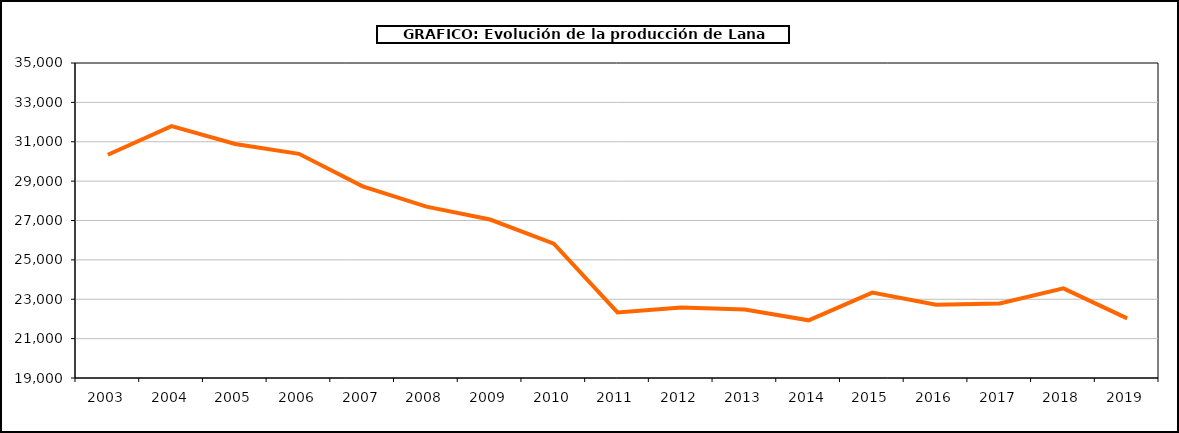
| Category | Lana |
|---|---|
| 2003.0 | 30340.64 |
| 2004.0 | 31796.74 |
| 2005.0 | 30888.43 |
| 2006.0 | 30387.145 |
| 2007.0 | 28736.496 |
| 2008.0 | 27705.371 |
| 2009.0 | 27048.693 |
| 2010.0 | 25825 |
| 2011.0 | 22333.5 |
| 2012.0 | 22583.2 |
| 2013.0 | 22476.583 |
| 2014.0 | 21929.646 |
| 2015.0 | 23336.469 |
| 2016.0 | 22723.741 |
| 2017.0 | 22788.995 |
| 2018.0 | 23553.736 |
| 2019.0 | 22028.649 |